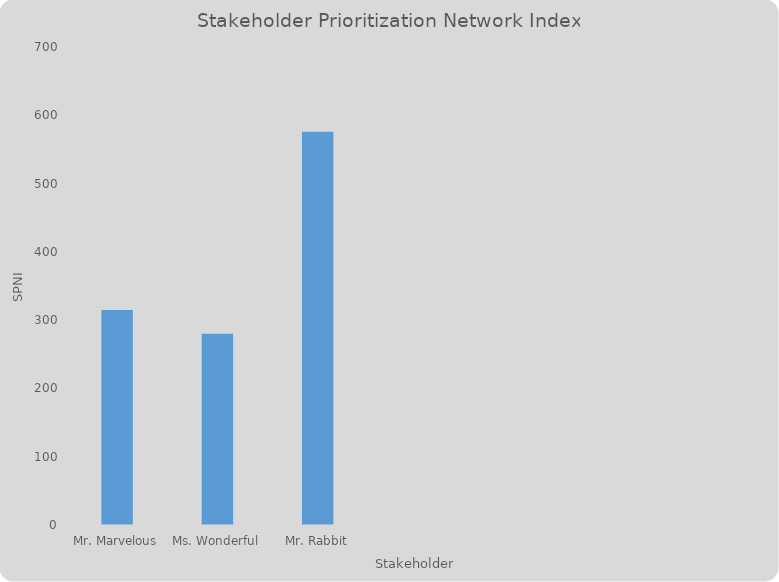
| Category | Series 0 |
|---|---|
| Mr. Marvelous | 315 |
| Ms. Wonderful | 280 |
| Mr. Rabbit | 576 |